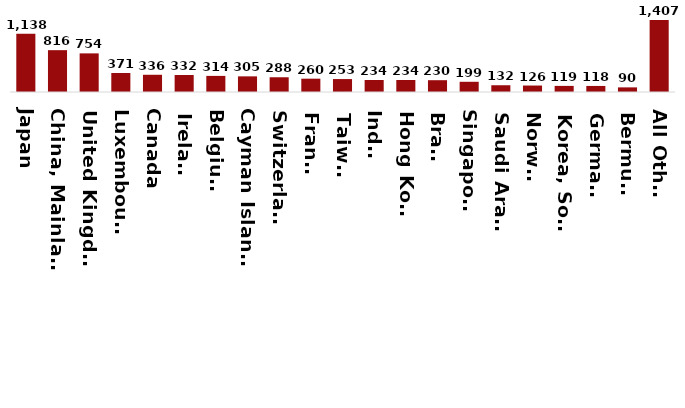
| Category | Series 0 |
|---|---|
| Japan | 1138.2 |
| China, Mainland | 816.3 |
| United Kingdom | 753.7 |
| Luxembourg | 370.7 |
| Canada | 336.1 |
| Ireland | 332.3 |
| Belgium | 314.4 |
| Cayman Islands | 305.2 |
| Switzerland | 287.6 |
| France | 260 |
| Taiwan | 252.5 |
| India | 233.7 |
| Hong Kong | 233.7 |
| Brazil | 230.3 |
| Singapore | 199.2 |
| Saudi Arabia | 131.9 |
| Norway | 126.1 |
| Korea, South | 119 |
| Germany | 118.1 |
| Bermuda | 90.2 |
| All Other | 1406.9 |